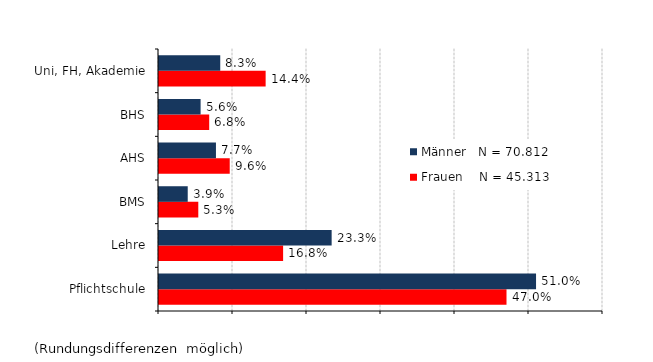
| Category | Frauen    N = 45.313 | Männer   N = 70.812 |
|---|---|---|
| Pflichtschule | 0.47 | 0.51 |
| Lehre | 0.168 | 0.233 |
| BMS | 0.053 | 0.039 |
| AHS | 0.096 | 0.077 |
| BHS | 0.068 | 0.056 |
| Uni, FH, Akademie | 0.144 | 0.083 |